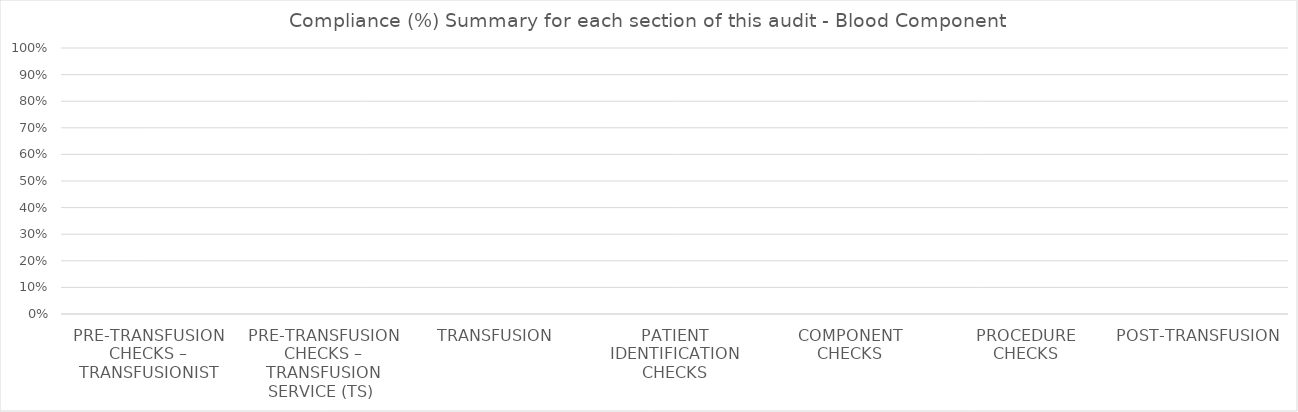
| Category | Series 0 |
|---|---|
| PRE-TRANSFUSION CHECKS – TRANSFUSIONIST | 0 |
| PRE-TRANSFUSION CHECKS – TRANSFUSION SERVICE (TS)  | 0 |
| TRANSFUSION  | 0 |
| PATIENT IDENTIFICATION CHECKS | 0 |
| COMPONENT CHECKS | 0 |
| PROCEDURE CHECKS | 0 |
| POST-TRANSFUSION | 0 |